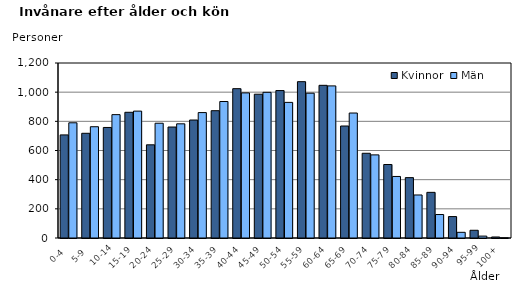
| Category | Kvinnor | Män |
|---|---|---|
|   0-4  | 707 | 790 |
|   5-9  | 718 | 763 |
| 10-14 | 758 | 846 |
| 15-19  | 862 | 870 |
| 20-24  | 639 | 787 |
| 25-29  | 761 | 783 |
| 30-34  | 809 | 860 |
| 35-39  | 873 | 936 |
| 40-44  | 1024 | 995 |
| 45-49  | 986 | 999 |
| 50-54  | 1011 | 930 |
| 55-59  | 1072 | 993 |
| 60-64  | 1047 | 1043 |
| 65-69  | 768 | 857 |
| 70-74  | 581 | 570 |
| 75-79  | 504 | 422 |
| 80-84  | 414 | 295 |
| 85-89  | 313 | 161 |
| 90-94  | 147 | 39 |
| 95-99 | 53 | 13 |
| 100+ | 7 | 1 |